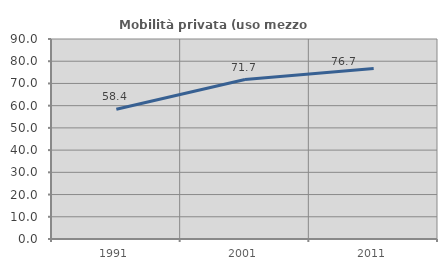
| Category | Mobilità privata (uso mezzo privato) |
|---|---|
| 1991.0 | 58.379 |
| 2001.0 | 71.739 |
| 2011.0 | 76.678 |